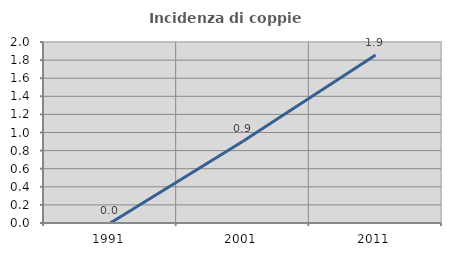
| Category | Incidenza di coppie miste |
|---|---|
| 1991.0 | 0 |
| 2001.0 | 0.903 |
| 2011.0 | 1.856 |